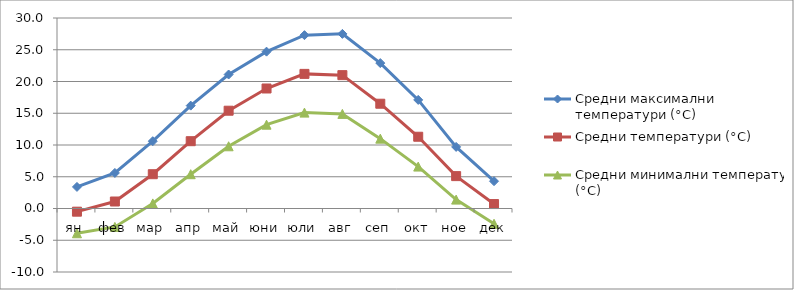
| Category | Средни максимални температури (°C) | Средни температури (°C) | Средни минимални температури (°C) |
|---|---|---|---|
| ян | 3.4 | -0.5 | -3.9 |
| фев | 5.6 | 1.1 | -2.9 |
| мар | 10.6 | 5.4 | 0.8 |
| апр | 16.2 | 10.6 | 5.4 |
| май | 21.1 | 15.4 | 9.8 |
| юни | 24.7 | 18.9 | 13.2 |
| юли | 27.3 | 21.2 | 15.1 |
| авг | 27.5 | 21 | 14.9 |
| сеп | 22.9 | 16.5 | 11 |
| окт | 17.1 | 11.3 | 6.6 |
| ное | 9.7 | 5.1 | 1.4 |
| дек | 4.3 | 0.7 | -2.4 |